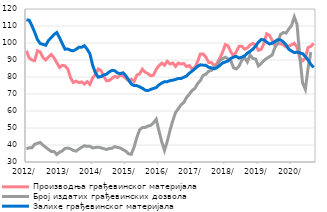
| Category | Производња грађевинског материјала |
|---|---|
| 2012-01-01 | 95.517 |
| 2012-02-01 | 91.239 |
| 2012-03-01 | 89.991 |
| 2012-04-01 | 89.623 |
| 2012-05-01 | 95.453 |
| 2012-06-01 | 94.689 |
| 2012-07-01 | 91.501 |
| 2012-08-01 | 90.037 |
| 2012-09-01 | 91.806 |
| 2012-10-01 | 93.282 |
| 2012-11-01 | 91.3 |
| 2012-12-01 | 88.463 |
| 2013-01-01 | 85.603 |
| 2013-02-01 | 86.854 |
| 2013-03-01 | 86.531 |
| 2013-04-01 | 84.717 |
| 2013-05-01 | 79.543 |
| 2013-06-01 | 76.73 |
| 2013-07-01 | 77.58 |
| 2013-08-01 | 76.666 |
| 2013-09-01 | 77.115 |
| 2013-10-01 | 75.853 |
| 2013-11-01 | 77.251 |
| 2013-12-01 | 75.642 |
| 2014-01-01 | 79.494 |
| 2014-02-01 | 81.341 |
| 2014-03-01 | 84.747 |
| 2014-04-01 | 83.793 |
| 2014-05-01 | 80.415 |
| 2014-06-01 | 77.752 |
| 2014-07-01 | 77.946 |
| 2014-08-01 | 79.204 |
| 2014-09-01 | 80.398 |
| 2014-10-01 | 79.72 |
| 2014-11-01 | 81.026 |
| 2014-12-01 | 80.553 |
| 2015-01-01 | 79.271 |
| 2015-02-01 | 77.704 |
| 2015-03-01 | 78.736 |
| 2015-04-01 | 77.337 |
| 2015-05-01 | 81.182 |
| 2015-06-01 | 81.789 |
| 2015-07-01 | 84.626 |
| 2015-08-01 | 82.837 |
| 2015-09-01 | 82.011 |
| 2015-10-01 | 80.739 |
| 2015-11-01 | 81.084 |
| 2015-12-01 | 84.457 |
| 2016-01-01 | 86.664 |
| 2016-02-01 | 88.136 |
| 2016-03-01 | 86.877 |
| 2016-04-01 | 89.25 |
| 2016-05-01 | 87.681 |
| 2016-06-01 | 88.25 |
| 2016-07-01 | 86.216 |
| 2016-08-01 | 88.23 |
| 2016-09-01 | 87.612 |
| 2016-10-01 | 87.936 |
| 2016-11-01 | 86.13 |
| 2016-12-01 | 86.758 |
| 2017-01-01 | 84.641 |
| 2017-02-01 | 85.655 |
| 2017-03-01 | 89.061 |
| 2017-04-01 | 93.59 |
| 2017-05-01 | 93.56 |
| 2017-06-01 | 91.704 |
| 2017-07-01 | 88.518 |
| 2017-08-01 | 88.608 |
| 2017-09-01 | 86.592 |
| 2017-10-01 | 88.052 |
| 2017-11-01 | 91.028 |
| 2017-12-01 | 94.29 |
| 2018-01-01 | 99.064 |
| 2018-02-01 | 98.396 |
| 2018-03-01 | 94.909 |
| 2018-04-01 | 92.214 |
| 2018-05-01 | 94.843 |
| 2018-06-01 | 98.101 |
| 2018-07-01 | 98.158 |
| 2018-08-01 | 96.385 |
| 2018-09-01 | 97.07 |
| 2018-10-31 | 98.846 |
| 2018-11-30 | 99.736 |
| 2018-12-31 | 98.849 |
| 2019-01-31 | 95.726 |
| 2019-02-28 | 96.212 |
| 2019-03-31 | 99.646 |
| 2019-04-30 | 105.381 |
| 2019-05-31 | 104.578 |
| 2019-06-30 | 101.442 |
| 2019-07-31 | 98.652 |
| 2019-08-31 | 99.611 |
| 2019-09-30 | 99.535 |
| 2019-10-31 | 98.906 |
| 2019-11-30 | 97.696 |
| 2019-12-31 | 98.183 |
| 2020-01-31 | 98.925 |
| 2020-02-29 | 99.81 |
| 2020-03-31 | 97.593 |
| 2020-04-30 | 90.881 |
| 2020-05-31 | 89.518 |
| 2020-06-30 | 91.276 |
| 2020-07-31 | 97.418 |
| 2020-08-31 | 98.029 |
| 2020-09-30 | 99.798 |